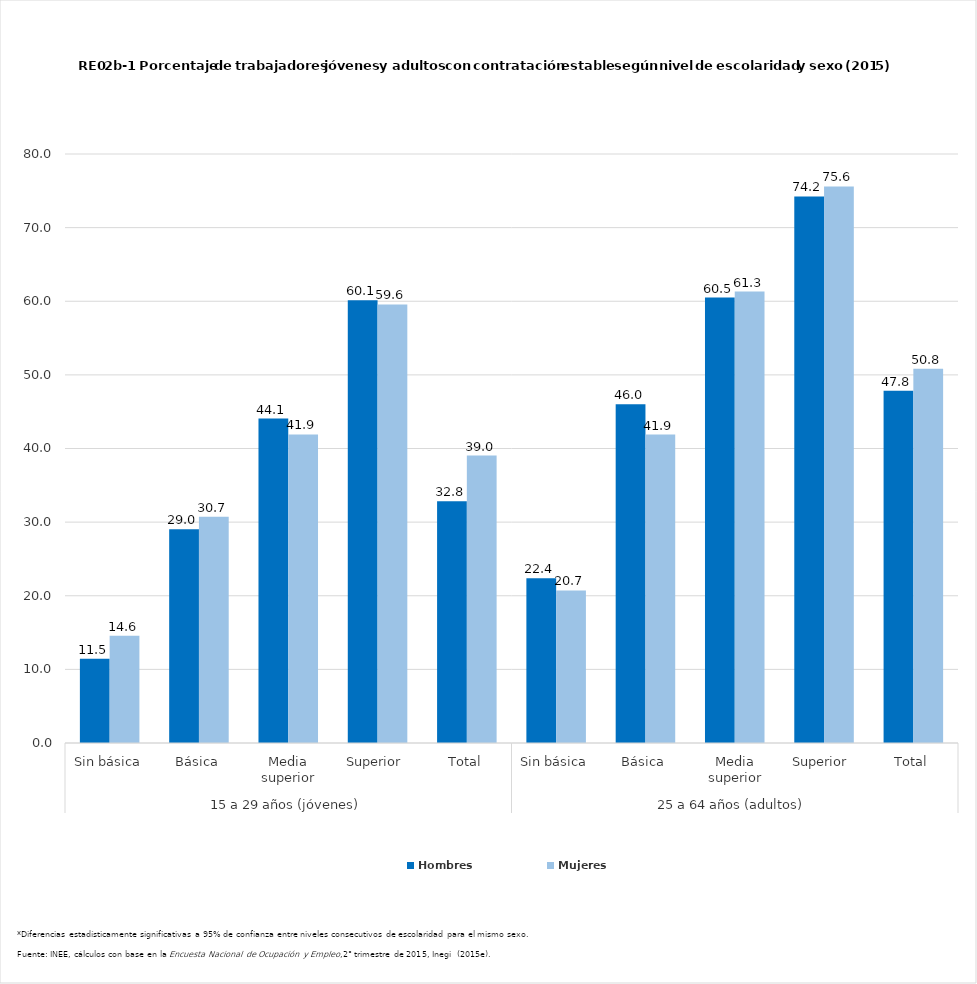
| Category | Hombres | Mujeres |
|---|---|---|
| 0 | 11.455 | 14.583 |
| 1 | 29.029 | 30.731 |
| 2 | 44.071 | 41.918 |
| 3 | 60.124 | 59.575 |
| 4 | 32.84 | 39.041 |
| 5 | 22.381 | 20.722 |
| 6 | 46.021 | 41.887 |
| 7 | 60.494 | 61.324 |
| 8 | 74.24 | 75.587 |
| 9 | 47.837 | 50.839 |